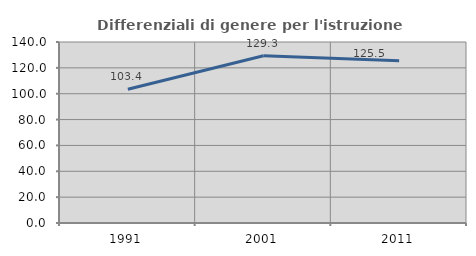
| Category | Differenziali di genere per l'istruzione superiore |
|---|---|
| 1991.0 | 103.429 |
| 2001.0 | 129.306 |
| 2011.0 | 125.511 |